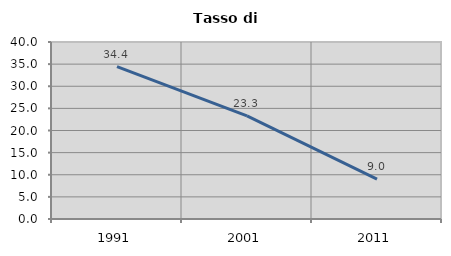
| Category | Tasso di disoccupazione   |
|---|---|
| 1991.0 | 34.426 |
| 2001.0 | 23.288 |
| 2011.0 | 9.016 |